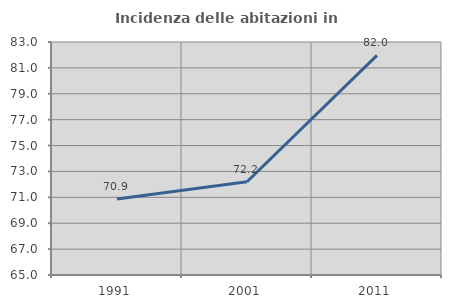
| Category | Incidenza delle abitazioni in proprietà  |
|---|---|
| 1991.0 | 70.863 |
| 2001.0 | 72.203 |
| 2011.0 | 81.969 |